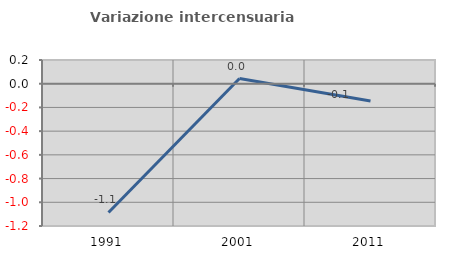
| Category | Variazione intercensuaria annua |
|---|---|
| 1991.0 | -1.086 |
| 2001.0 | 0.044 |
| 2011.0 | -0.146 |